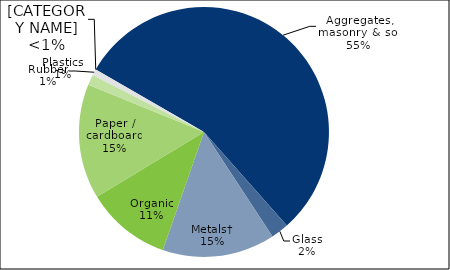
| Category | Series 0 |
|---|---|
| Aggregates, masonry & soil | 5507209 |
| Glass | 229997 |
| Metals† | 1455579 |
| Organic | 1098205 |
| Paper / cardboard | 1481017 |
| Plastics | 137167.42 |
| Rubber | 79350 |
| Textiles | 165 |
| Other | 0 |